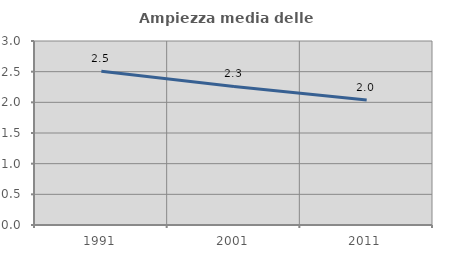
| Category | Ampiezza media delle famiglie |
|---|---|
| 1991.0 | 2.507 |
| 2001.0 | 2.259 |
| 2011.0 | 2.039 |